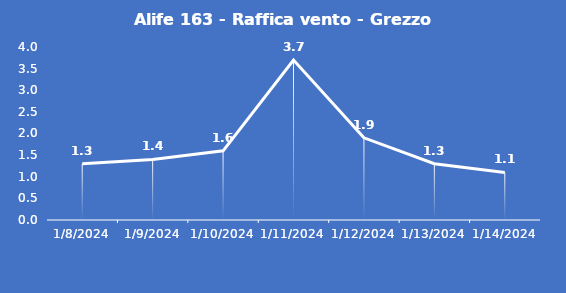
| Category | Alife 163 - Raffica vento - Grezzo (m/s) |
|---|---|
| 1/8/24 | 1.3 |
| 1/9/24 | 1.4 |
| 1/10/24 | 1.6 |
| 1/11/24 | 3.7 |
| 1/12/24 | 1.9 |
| 1/13/24 | 1.3 |
| 1/14/24 | 1.1 |